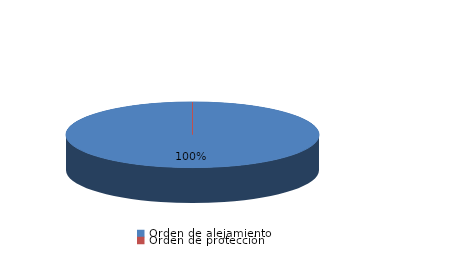
| Category | Series 0 |
|---|---|
| Orden de alejamiento | 58 |
| Orden de protección | 0 |